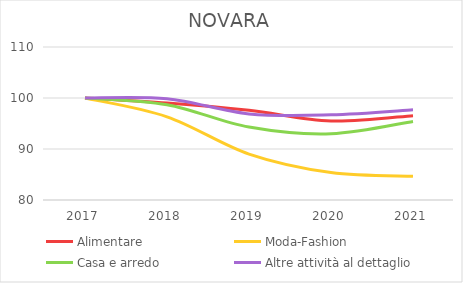
| Category | Alimentare | Moda-Fashion | Casa e arredo | Altre attività al dettaglio |
|---|---|---|---|---|
| 2017.0 | 100 | 100 | 100 | 100 |
| 2018.0 | 99.034 | 96.314 | 98.684 | 99.86 |
| 2019.0 | 97.585 | 89.01 | 94.298 | 96.882 |
| 2020.0 | 95.491 | 85.392 | 92.982 | 96.696 |
| 2021.0 | 96.538 | 84.642 | 95.395 | 97.673 |